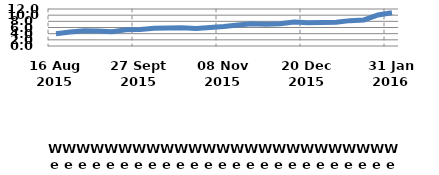
| Category | Series 0 |
|---|---|
| 0 | 4 |
| 1900-01-01 | 4.542 |
| 1900-01-02 | 4.967 |
| 1900-01-03 | 4.898 |
| 1900-01-04 | 4.638 |
| 1900-01-05 | 5.293 |
| 1900-01-06 | 5.325 |
| 1900-01-07 | 5.784 |
| 1900-01-08 | 5.807 |
| 1900-01-09 | 5.918 |
| 1900-01-10 | 5.69 |
| 1900-01-11 | 5.971 |
| 1900-01-12 | 6.305 |
| 1900-01-13 | 6.826 |
| 1900-01-14 | 7.202 |
| 1900-01-15 | 7.032 |
| 1900-01-16 | 7.227 |
| 1900-01-17 | 7.785 |
| 1900-01-18 | 7.576 |
| 1900-01-19 | 7.604 |
| 1900-01-20 | 7.697 |
| 1900-01-21 | 8.225 |
| 1900-01-22 | 8.464 |
| 1900-01-23 | 10.057 |
| 1900-01-24 | 10.802 |